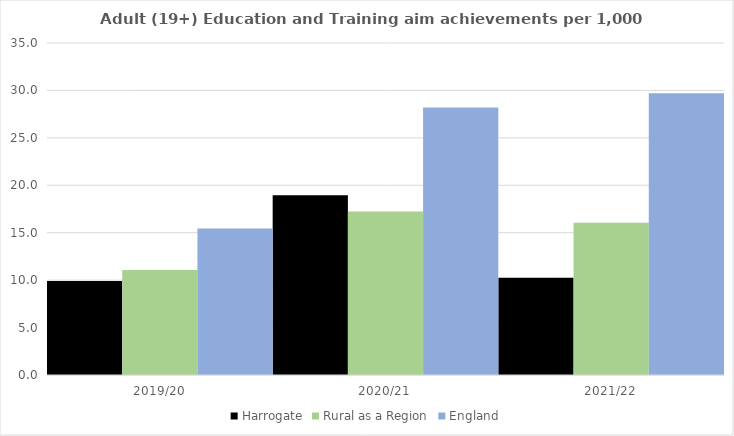
| Category | Harrogate | Rural as a Region | England |
|---|---|---|---|
| 2019/20 | 9.902 | 11.081 | 15.446 |
| 2020/21 | 18.946 | 17.224 | 28.211 |
| 2021/22 | 10.26 | 16.063 | 29.711 |